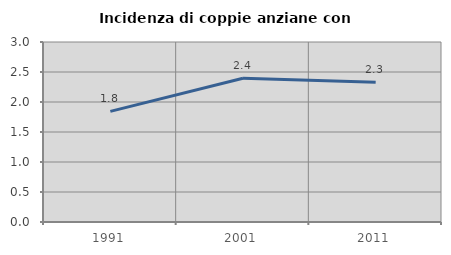
| Category | Incidenza di coppie anziane con figli |
|---|---|
| 1991.0 | 1.844 |
| 2001.0 | 2.397 |
| 2011.0 | 2.328 |